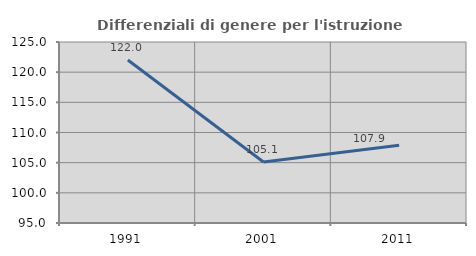
| Category | Differenziali di genere per l'istruzione superiore |
|---|---|
| 1991.0 | 122.007 |
| 2001.0 | 105.114 |
| 2011.0 | 107.896 |